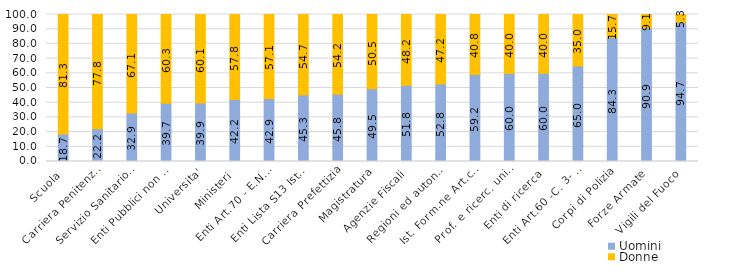
| Category | Uomini | Donne |
|---|---|---|
| Scuola | 18.689 | 81.311 |
| Carriera Penitenziaria | 22.222 | 77.778 |
| Servizio Sanitario Nazionale | 32.911 | 67.089 |
| Enti Pubblici non economici | 39.669 | 60.331 |
| Universita' | 39.857 | 60.143 |
| Ministeri | 42.194 | 57.806 |
| Enti Art.70 - E.N.A.C. | 42.857 | 57.143 |
| Enti Lista S13 Istat | 45.312 | 54.688 |
| Carriera Prefettizia | 45.833 | 54.167 |
| Magistratura | 49.51 | 50.49 |
| Agenzie Fiscali | 51.83 | 48.17 |
| Regioni ed autonomie locali | 52.759 | 47.241 |
| Ist. Form.ne Art.co Mus.le | 59.241 | 40.759 |
| Prof. e ricerc. universitari | 59.986 | 40.014 |
| Enti di ricerca | 60 | 40 |
| Enti Art.60 -C. 3- D.165/01 | 65 | 35 |
| Corpi di Polizia | 84.342 | 15.658 |
| Forze Armate | 90.881 | 9.119 |
| Vigili del Fuoco | 94.707 | 5.293 |